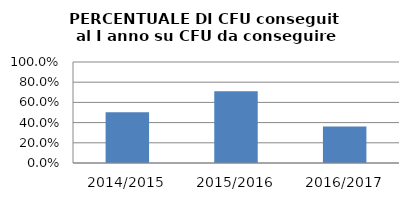
| Category | 2014/2015 2015/2016 2016/2017 |
|---|---|
| 2014/2015 | 0.502 |
| 2015/2016 | 0.71 |
| 2016/2017 | 0.361 |